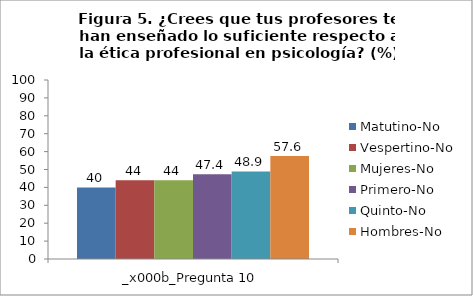
| Category | Matutino-No | Vespertino-No | Mujeres-No | Primero-No | Quinto-No | Hombres-No |
|---|---|---|---|---|---|---|
| 0 | 40 | 44 | 44 | 47.4 | 48.9 | 57.6 |